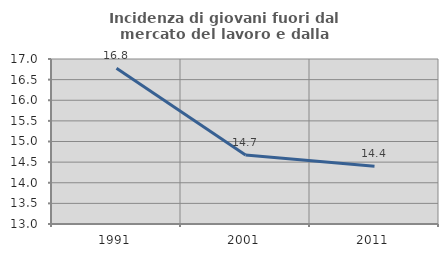
| Category | Incidenza di giovani fuori dal mercato del lavoro e dalla formazione  |
|---|---|
| 1991.0 | 16.779 |
| 2001.0 | 14.674 |
| 2011.0 | 14.402 |